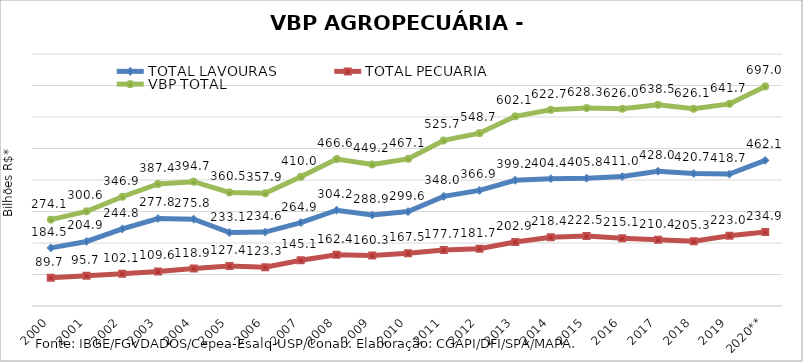
| Category | TOTAL LAVOURAS | TOTAL PECUÁRIA | VBP TOTAL |
|---|---|---|---|
| 2000 | 184.456 | 89.662 | 274.119 |
| 2001 | 204.897 | 95.658 | 300.555 |
| 2002 | 244.757 | 102.116 | 346.872 |
| 2003 | 277.797 | 109.604 | 387.401 |
| 2004 | 275.763 | 118.889 | 394.652 |
| 2005 | 233.145 | 127.359 | 360.504 |
| 2006 | 234.569 | 123.348 | 357.918 |
| 2007 | 264.903 | 145.113 | 410.016 |
| 2008 | 304.175 | 162.416 | 466.59 |
| 2009 | 288.926 | 160.303 | 449.229 |
| 2010 | 299.648 | 167.486 | 467.133 |
| 2011 | 348.004 | 177.659 | 525.663 |
| 2012 | 366.928 | 181.735 | 548.663 |
| 2013 | 399.22 | 202.885 | 602.105 |
| 2014 | 404.356 | 218.362 | 622.718 |
| 2015 | 405.823 | 222.451 | 628.275 |
| 2016 | 410.955 | 215.055 | 626.01 |
| 2017 | 428.029 | 210.434 | 638.463 |
| 2018 | 420.712 | 205.345 | 626.057 |
| 2019 | 418.696 | 222.977 | 641.673 |
| 2020** | 462.095 | 234.942 | 697.037 |